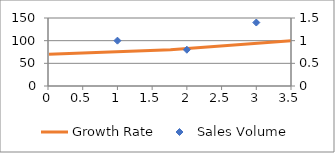
| Category | Growth Rate |
|---|---|
| Peking | 0.7 |
| New York | 0.8 |
| Paris | 1 |